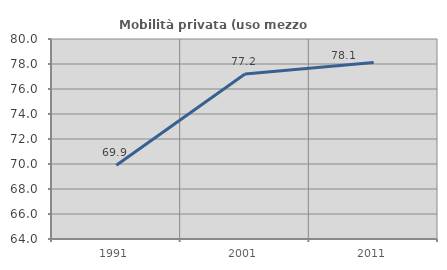
| Category | Mobilità privata (uso mezzo privato) |
|---|---|
| 1991.0 | 69.898 |
| 2001.0 | 77.203 |
| 2011.0 | 78.118 |